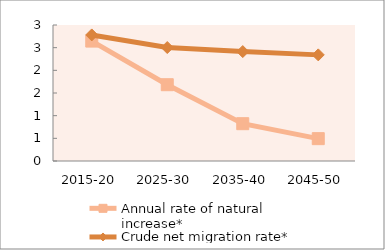
| Category | Annual rate of natural increase* | Crude net migration rate* |
|---|---|---|
| 2015-20 | 2.645 | 2.781 |
| 2025-30 | 1.683 | 2.503 |
| 2035-40 | 0.823 | 2.414 |
| 2045-50 | 0.493 | 2.341 |